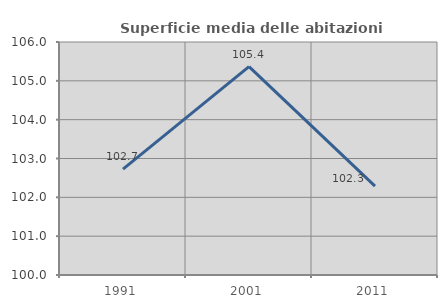
| Category | Superficie media delle abitazioni occupate |
|---|---|
| 1991.0 | 102.726 |
| 2001.0 | 105.365 |
| 2011.0 | 102.29 |